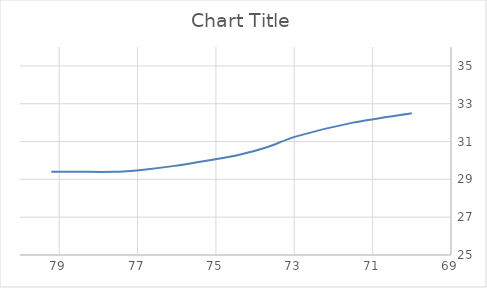
| Category | Series 0 |
|---|---|
| 79.2 | 29.4 |
| 78.5 | 29.4 |
| 77.6 | 29.4 |
| 76.9 | 29.5 |
| 76.1 | 29.7 |
| 75.2 | 30 |
| 74.4 | 30.3 |
| 73.7 | 30.7 |
| 72.9 | 31.3 |
| 71.5 | 32 |
| 70.0 | 32.5 |